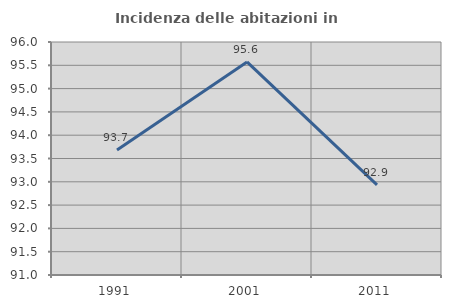
| Category | Incidenza delle abitazioni in proprietà  |
|---|---|
| 1991.0 | 93.68 |
| 2001.0 | 95.572 |
| 2011.0 | 92.933 |